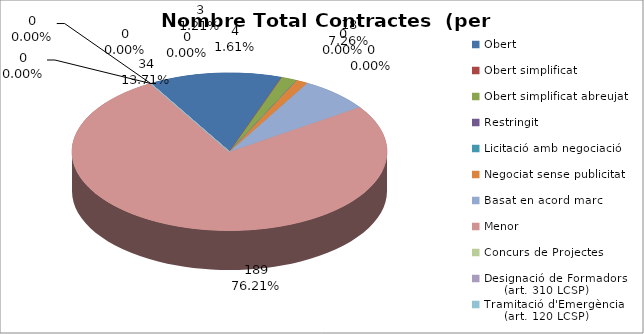
| Category | Nombre Total Contractes |
|---|---|
| Obert | 34 |
| Obert simplificat | 0 |
| Obert simplificat abreujat | 4 |
| Restringit | 0 |
| Licitació amb negociació | 0 |
| Negociat sense publicitat | 3 |
| Basat en acord marc | 18 |
| Menor | 189 |
| Concurs de Projectes | 0 |
| Designació de Formadors
     (art. 310 LCSP) | 0 |
| Tramitació d'Emergència
     (art. 120 LCSP) | 0 |